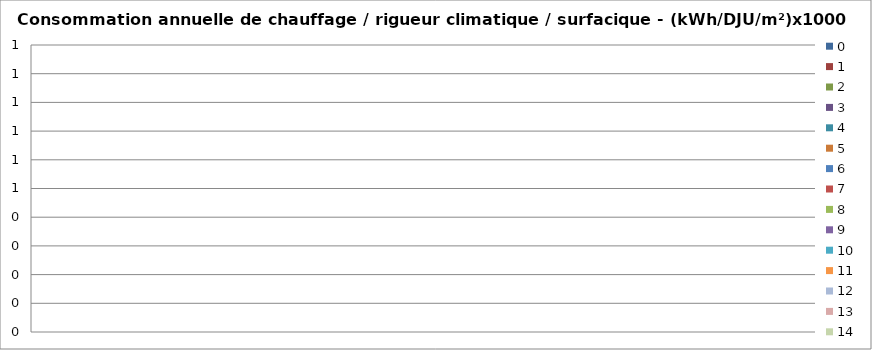
| Category | 0 | 1 | 2 | 3 | 4 | 5 | 6 | 7 | 8 | 9 | 10 | 11 | 12 | 13 | 14 |
|---|---|---|---|---|---|---|---|---|---|---|---|---|---|---|---|
| MOYENNE - (kWh/DJU/m²)x1000 | 0 | 0 | 0 | 0 | 0 | 0 | 0 | 0 | 0 | 0 | 0 | 0 | 0 | 0 | 0 |